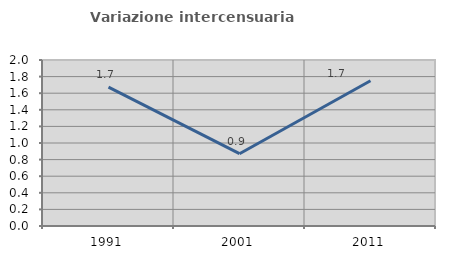
| Category | Variazione intercensuaria annua |
|---|---|
| 1991.0 | 1.673 |
| 2001.0 | 0.871 |
| 2011.0 | 1.75 |